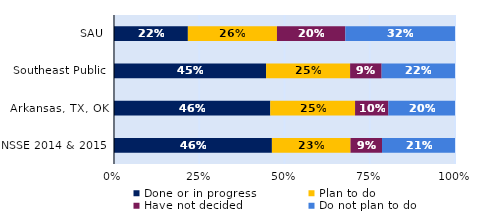
| Category | Done or in progress | Plan to do | Have not decided | Do not plan to do |
|---|---|---|---|---|
| SAU | 0.217 | 0.261 | 0.201 | 0.322 |
| Southeast Public | 0.446 | 0.246 | 0.092 | 0.215 |
| Arkansas, TX, OK | 0.458 | 0.249 | 0.098 | 0.195 |
| NSSE 2014 & 2015 | 0.463 | 0.231 | 0.092 | 0.214 |